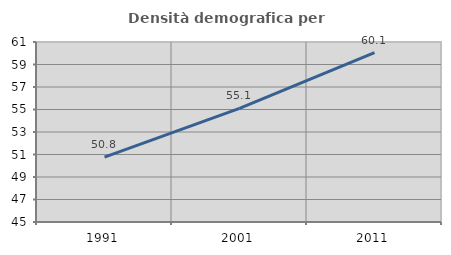
| Category | Densità demografica |
|---|---|
| 1991.0 | 50.77 |
| 2001.0 | 55.104 |
| 2011.0 | 60.057 |